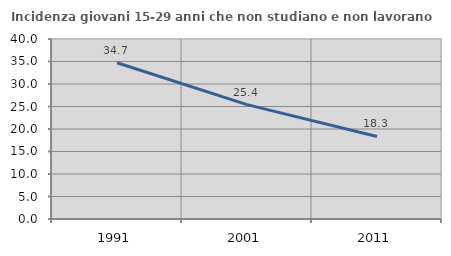
| Category | Incidenza giovani 15-29 anni che non studiano e non lavorano  |
|---|---|
| 1991.0 | 34.727 |
| 2001.0 | 25.414 |
| 2011.0 | 18.343 |